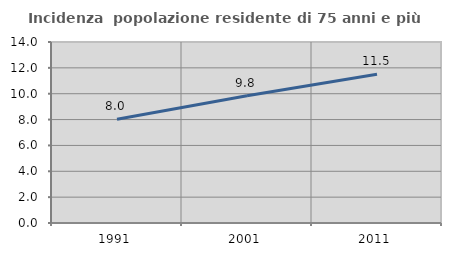
| Category | Incidenza  popolazione residente di 75 anni e più |
|---|---|
| 1991.0 | 8.025 |
| 2001.0 | 9.844 |
| 2011.0 | 11.506 |